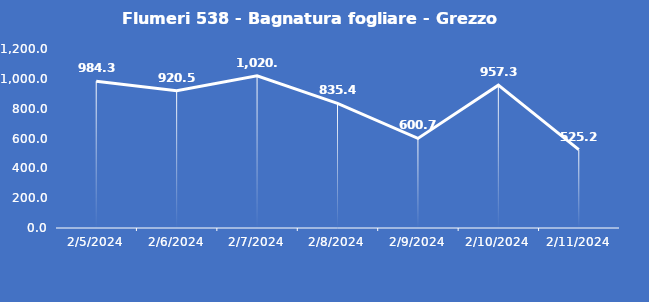
| Category | Flumeri 538 - Bagnatura fogliare - Grezzo (min) |
|---|---|
| 2/5/24 | 984.3 |
| 2/6/24 | 920.5 |
| 2/7/24 | 1020.6 |
| 2/8/24 | 835.4 |
| 2/9/24 | 600.7 |
| 2/10/24 | 957.3 |
| 2/11/24 | 525.2 |